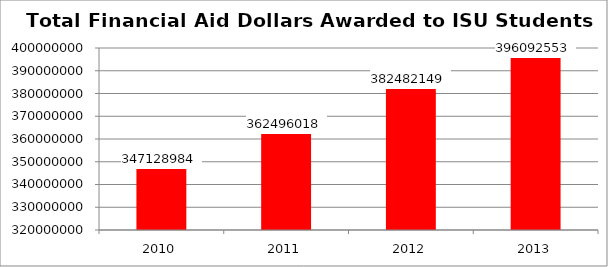
| Category | Total Amount Awarded |
|---|---|
| 2010.0 | 347128984 |
| 2011.0 | 362496018 |
| 2012.0 | 382482149 |
| 2013.0 | 396092553 |